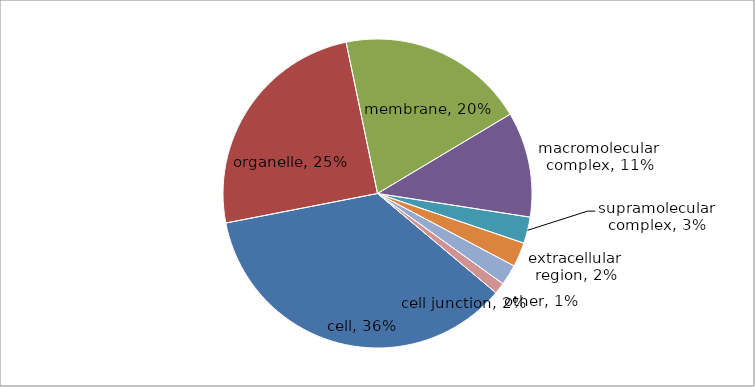
| Category | Series 0 |
|---|---|
| cell | 182 |
| organelle | 126 |
| membrane | 100 |
| macromolecular complex | 56 |
| supramolecular complex | 14 |
| extracellular region | 13 |
| cell junction | 11 |
| other | 6 |